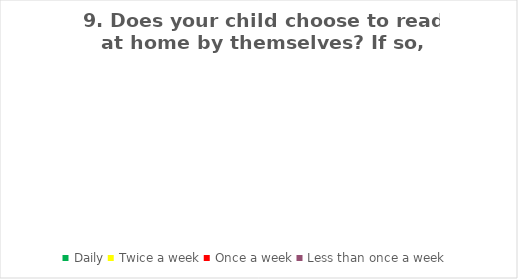
| Category | Series 0 |
|---|---|
| Daily | 0 |
| Twice a week | 0 |
| Once a week | 0 |
| Less than once a week | 0 |